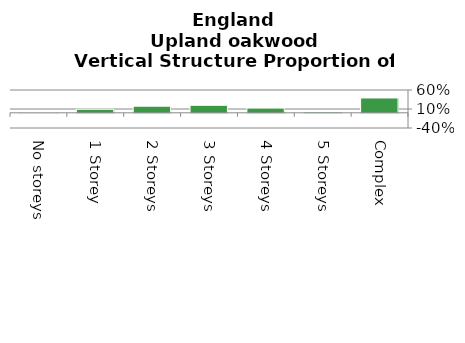
| Category | 0% |
|---|---|
| No storeys | 0.001 |
| 1 Storey | 0.093 |
| 2 Storeys | 0.174 |
| 3 Storeys | 0.197 |
| 4 Storeys | 0.124 |
| 5 Storeys | 0.021 |
| Complex | 0.391 |